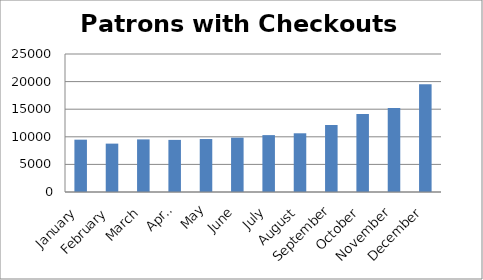
| Category | Series 0 |
|---|---|
| January | 9479 |
| February | 8764 |
| March | 9530 |
| April | 9439 |
| May | 9596 |
| June | 9845 |
| July | 10305 |
| August | 10635 |
| September | 12125 |
| October | 14134 |
| November | 15239 |
| December | 19499 |